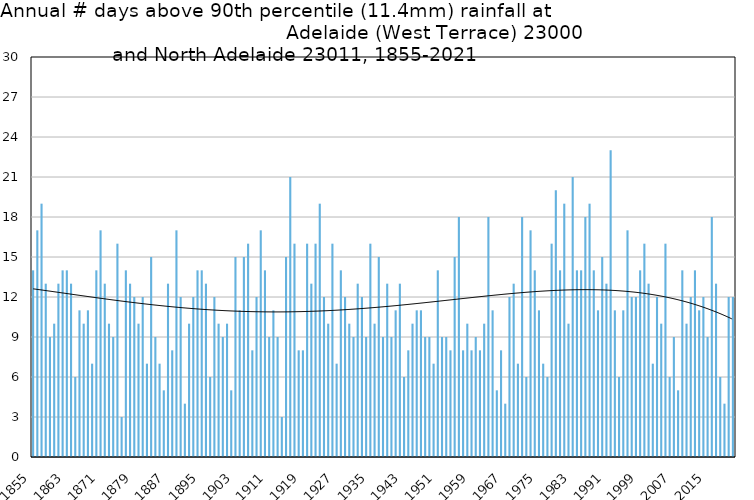
| Category | Annual # days above 90th percentile |
|---|---|
| 1855 | 14 |
| 1856 | 17 |
| 1857 | 19 |
| 1858 | 13 |
| 1859 | 9 |
| 1860 | 10 |
| 1861 | 13 |
| 1862 | 14 |
| 1863 | 14 |
| 1864 | 13 |
| 1865 | 6 |
| 1866 | 11 |
| 1867 | 10 |
| 1868 | 11 |
| 1869 | 7 |
| 1870 | 14 |
| 1871 | 17 |
| 1872 | 13 |
| 1873 | 10 |
| 1874 | 9 |
| 1875 | 16 |
| 1876 | 3 |
| 1877 | 14 |
| 1878 | 13 |
| 1879 | 12 |
| 1880 | 10 |
| 1881 | 12 |
| 1882 | 7 |
| 1883 | 15 |
| 1884 | 9 |
| 1885 | 7 |
| 1886 | 5 |
| 1887 | 13 |
| 1888 | 8 |
| 1889 | 17 |
| 1890 | 12 |
| 1891 | 4 |
| 1892 | 10 |
| 1893 | 12 |
| 1894 | 14 |
| 1895 | 14 |
| 1896 | 13 |
| 1897 | 6 |
| 1898 | 12 |
| 1899 | 10 |
| 1900 | 9 |
| 1901 | 10 |
| 1902 | 5 |
| 1903 | 15 |
| 1904 | 11 |
| 1905 | 15 |
| 1906 | 16 |
| 1907 | 8 |
| 1908 | 12 |
| 1909 | 17 |
| 1910 | 14 |
| 1911 | 9 |
| 1912 | 11 |
| 1913 | 9 |
| 1914 | 3 |
| 1915 | 15 |
| 1916 | 21 |
| 1917 | 16 |
| 1918 | 8 |
| 1919 | 8 |
| 1920 | 16 |
| 1921 | 13 |
| 1922 | 16 |
| 1923 | 19 |
| 1924 | 12 |
| 1925 | 10 |
| 1926 | 16 |
| 1927 | 7 |
| 1928 | 14 |
| 1929 | 12 |
| 1930 | 10 |
| 1931 | 9 |
| 1932 | 13 |
| 1933 | 12 |
| 1934 | 9 |
| 1935 | 16 |
| 1936 | 10 |
| 1937 | 15 |
| 1938 | 9 |
| 1939 | 13 |
| 1940 | 9 |
| 1941 | 11 |
| 1942 | 13 |
| 1943 | 6 |
| 1944 | 8 |
| 1945 | 10 |
| 1946 | 11 |
| 1947 | 11 |
| 1948 | 9 |
| 1949 | 9 |
| 1950 | 7 |
| 1951 | 14 |
| 1952 | 9 |
| 1953 | 9 |
| 1954 | 8 |
| 1955 | 15 |
| 1956 | 18 |
| 1957 | 8 |
| 1958 | 10 |
| 1959 | 8 |
| 1960 | 9 |
| 1961 | 8 |
| 1962 | 10 |
| 1963 | 18 |
| 1964 | 11 |
| 1965 | 5 |
| 1966 | 8 |
| 1967 | 4 |
| 1968 | 12 |
| 1969 | 13 |
| 1970 | 7 |
| 1971 | 18 |
| 1972 | 6 |
| 1973 | 17 |
| 1974 | 14 |
| 1975 | 11 |
| 1976 | 7 |
| 1977 | 6 |
| 1978 | 16 |
| 1979 | 20 |
| 1980 | 14 |
| 1981 | 19 |
| 1982 | 10 |
| 1983 | 21 |
| 1984 | 14 |
| 1985 | 14 |
| 1986 | 18 |
| 1987 | 19 |
| 1988 | 14 |
| 1989 | 11 |
| 1990 | 15 |
| 1991 | 13 |
| 1992 | 23 |
| 1993 | 11 |
| 1994 | 6 |
| 1995 | 11 |
| 1996 | 17 |
| 1997 | 12 |
| 1998 | 12 |
| 1999 | 14 |
| 2000 | 16 |
| 2001 | 13 |
| 2002 | 7 |
| 2003 | 12 |
| 2004 | 10 |
| 2005 | 16 |
| 2006 | 6 |
| 2007 | 9 |
| 2008 | 5 |
| 2009 | 14 |
| 2010 | 10 |
| 2011 | 12 |
| 2012 | 14 |
| 2013 | 11 |
| 2014 | 12 |
| 2015 | 9 |
| 2016 | 18 |
| 2017 | 13 |
| 2018 | 6 |
| 2019 | 4 |
| 2020 | 12 |
| 2021 | 12 |